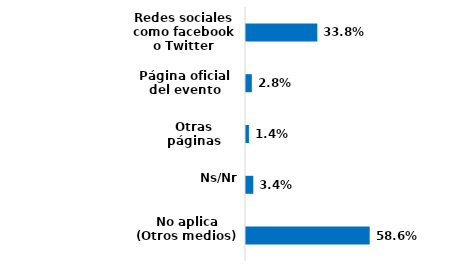
| Category | Series 0 |
|---|---|
| Redes sociales como facebook o Twitter | 0.338 |
| Página oficial del evento | 0.028 |
| Otras páginas | 0.014 |
| Ns/Nr | 0.034 |
| No aplica (Otros medios) | 0.586 |